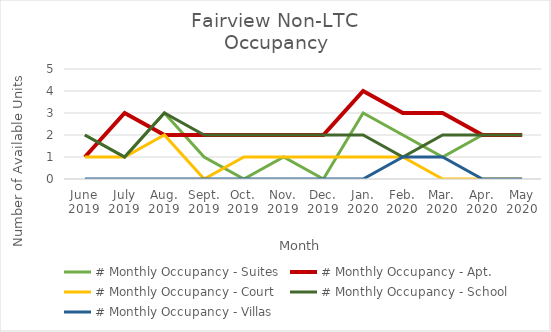
| Category | # Monthly Occupancy - Suites | # Monthly Occupancy - Apt. | # Monthly Occupancy - Court | # Monthly Occupancy - School | # Monthly Occupancy - Villas |
|---|---|---|---|---|---|
| June
2019 | 2 | 1 | 1 | 2 | 0 |
| July
2019 | 1 | 3 | 1 | 1 | 0 |
| Aug.
2019 | 3 | 2 | 2 | 3 | 0 |
| Sept.
2019 | 1 | 2 | 0 | 2 | 0 |
| Oct.
2019 | 0 | 2 | 1 | 2 | 0 |
| Nov.
2019 | 1 | 2 | 1 | 2 | 0 |
| Dec.
2019 | 0 | 2 | 1 | 2 | 0 |
| Jan.
2020 | 3 | 4 | 1 | 2 | 0 |
| Feb.
2020 | 2 | 3 | 1 | 1 | 1 |
| Mar.
2020 | 1 | 3 | 0 | 2 | 1 |
| Apr.
2020 | 2 | 2 | 0 | 2 | 0 |
| May
2020 | 2 | 2 | 0 | 2 | 0 |